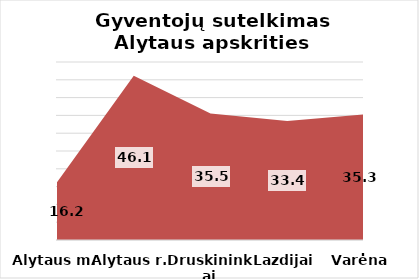
| Category | Series 0 |
|---|---|
| Alytaus m. | 16.24 |
| Alytaus r. | 46.13 |
| Druskininkai | 35.54 |
| Lazdijai | 33.43 |
| Varėna | 35.29 |